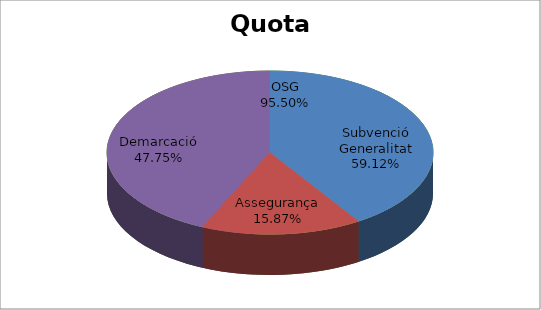
| Category | Series 0 |
|---|---|
| Subvenció Generalitat | -13 |
| Assegurança | 3.49 |
| OSG | 21 |
| Demarcació | 10.5 |